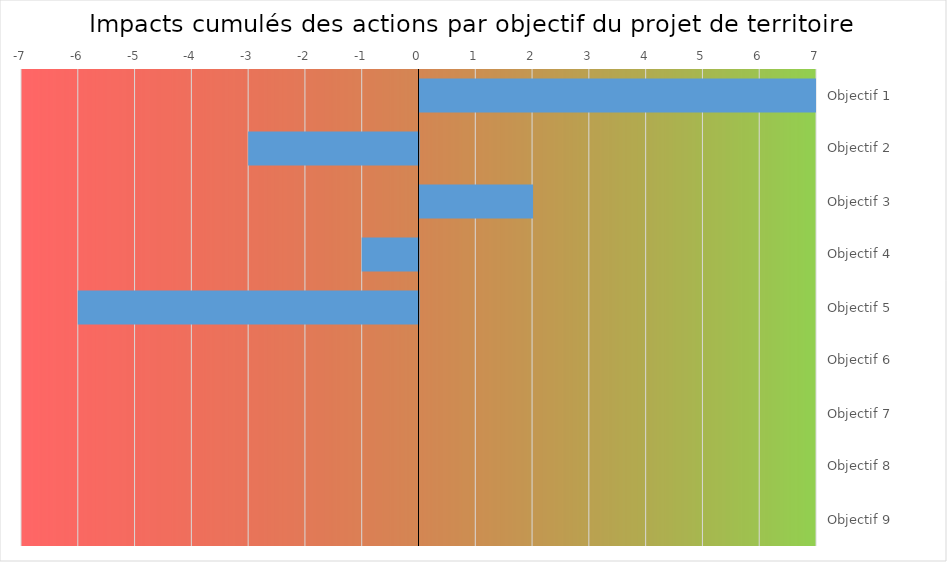
| Category | Series 0 |
|---|---|
| Objectif 1 | 11 |
| Objectif 2 | -3 |
| Objectif 3 | 2 |
| Objectif 4 | -1 |
| Objectif 5 | -6 |
| Objectif 6 | 0 |
| Objectif 7 | 0 |
| Objectif 8 | 0 |
| Objectif 9 | 0 |